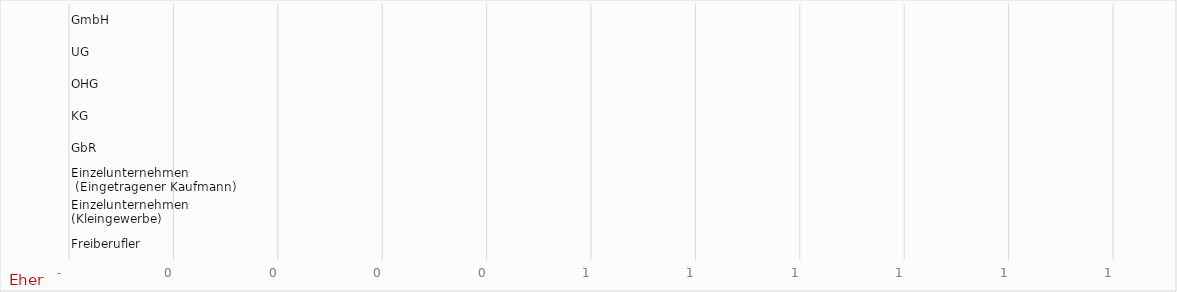
| Category | Series 0 |
|---|---|
| Freiberufler | 0 |
| Einzelunternehmen
(Kleingewerbe) | 0 |
| Einzelunternehmen
 (Eingetragener Kaufmann) | 0 |
| GbR | 0 |
| KG | 0 |
| OHG | 0 |
| UG | 0 |
| GmbH | 0 |